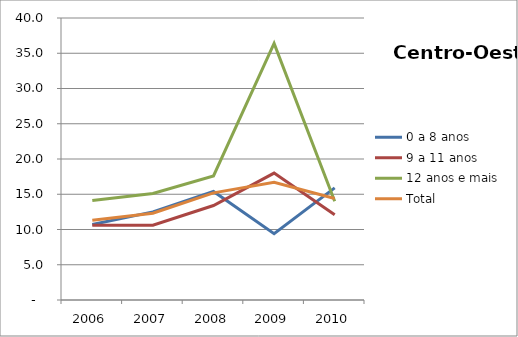
| Category | 0 a 8 anos | 9 a 11 anos | 12 anos e mais | Total |
|---|---|---|---|---|
| 2006.0 | 10.7 | 10.6 | 14.1 | 11.3 |
| 2007.0 | 12.5 | 10.6 | 15.1 | 12.3 |
| 2008.0 | 15.4 | 13.4 | 17.6 | 15.2 |
| 2009.0 | 9.4 | 18 | 36.4 | 16.7 |
| 2010.0 | 15.9 | 12.1 | 14 | 14.4 |